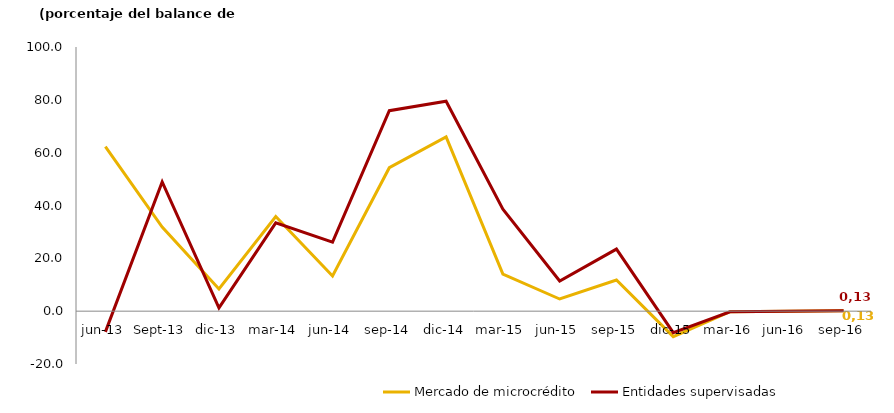
| Category | Mercado de microcrédito | Entidades supervisadas |
|---|---|---|
| jun-13 | 62.296 | -7.846 |
| sep-13 | 31.832 | 48.907 |
| dic-13 | 8.424 | 1.249 |
| mar-14 | 35.824 | 33.423 |
| jun-14 | 13.3 | 26.101 |
| sep-14 | 54.3 | 75.891 |
| dic-14 | 66 | 79.452 |
| mar-15 | 14 | 38.637 |
| jun-15 | 4.6 | 11.4 |
| sep-15 | 11.8 | 23.5 |
| dic-15 | -9.635 | -8.111 |
| mar-16 | -0.204 | -0.209 |
| jun-16 | -0.014 | -0.008 |
| sep-16 | 0.131 | 0.13 |